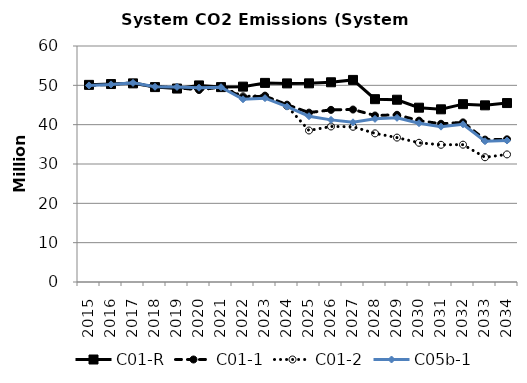
| Category | C01-R | C01-1 | C01-2 | C05b-1 |
|---|---|---|---|---|
| 2015.0 | 50.118 | 49.98 | 50.118 | 49.98 |
| 2016.0 | 50.329 | 50.239 | 50.238 | 50.239 |
| 2017.0 | 50.499 | 50.623 | 50.622 | 50.623 |
| 2018.0 | 49.555 | 49.637 | 49.636 | 49.638 |
| 2019.0 | 49.181 | 49.422 | 49.421 | 49.592 |
| 2020.0 | 49.976 | 48.827 | 48.938 | 49.394 |
| 2021.0 | 49.548 | 49.578 | 49.665 | 49.521 |
| 2022.0 | 49.671 | 46.971 | 47.203 | 46.454 |
| 2023.0 | 50.618 | 47.262 | 47.383 | 46.739 |
| 2024.0 | 50.491 | 45.086 | 44.746 | 44.577 |
| 2025.0 | 50.508 | 43.063 | 38.519 | 42.148 |
| 2026.0 | 50.777 | 43.764 | 39.539 | 41.219 |
| 2027.0 | 51.38 | 43.847 | 39.462 | 40.597 |
| 2028.0 | 46.481 | 42.329 | 37.785 | 41.477 |
| 2029.0 | 46.342 | 42.511 | 36.715 | 41.738 |
| 2030.0 | 44.317 | 41.021 | 35.397 | 40.374 |
| 2031.0 | 43.901 | 40.228 | 34.881 | 39.496 |
| 2032.0 | 45.215 | 40.585 | 34.915 | 40.087 |
| 2033.0 | 44.915 | 36.207 | 31.713 | 35.786 |
| 2034.0 | 45.496 | 36.272 | 32.435 | 35.965 |